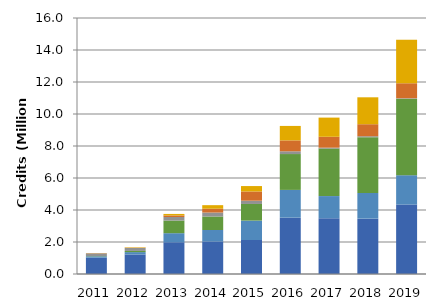
| Category | Ethanol | Biodiesel | Renewable Diesel | Fossil Natural Gas | Biomethane | Electricity |
|---|---|---|---|---|---|---|
| 2011.0 | 1.024 | 0.084 | 0.017 | 0.164 | 0.015 | 0.008 |
| 2012.0 | 1.219 | 0.149 | 0.073 | 0.183 | 0.015 | 0.027 |
| 2013.0 | 1.984 | 0.567 | 0.79 | 0.222 | 0.098 | 0.094 |
| 2014.0 | 2.031 | 0.718 | 0.845 | 0.247 | 0.24 | 0.221 |
| 2015.0 | 2.125 | 1.214 | 1.038 | 0.206 | 0.576 | 0.338 |
| 2016.0 | 3.519 | 1.737 | 2.241 | 0.171 | 0.682 | 0.905 |
| 2017.0 | 3.488 | 1.382 | 2.967 | 0.058 | 0.681 | 1.198 |
| 2018.0 | 3.459 | 1.607 | 3.485 | 0.059 | 0.751 | 1.682 |
| 2019.0 | 4.342 | 1.832 | 4.781 | 0.031 | 0.937 | 2.721 |